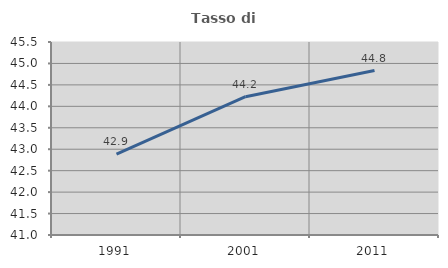
| Category | Tasso di occupazione   |
|---|---|
| 1991.0 | 42.886 |
| 2001.0 | 44.224 |
| 2011.0 | 44.834 |